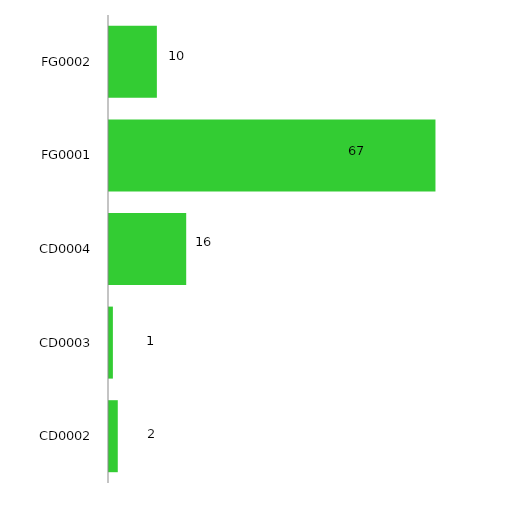
| Category | 2019 |
|---|---|
| CD0002 | 2 |
| CD0003 | 1 |
| CD0004 | 16 |
| FG0001 | 67 |
| FG0002 | 10 |